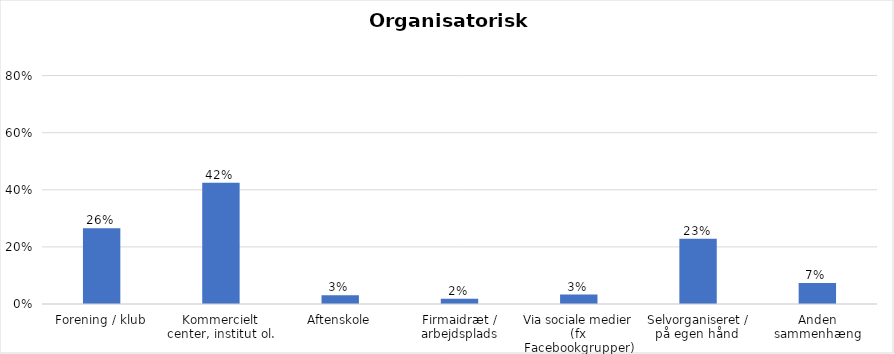
| Category | % |
|---|---|
| Forening / klub | 0.265 |
| Kommercielt center, institut ol. | 0.425 |
| Aftenskole | 0.031 |
| Firmaidræt / arbejdsplads | 0.019 |
| Via sociale medier (fx Facebookgrupper) | 0.033 |
| Selvorganiseret / på egen hånd  | 0.228 |
| Anden sammenhæng | 0.074 |